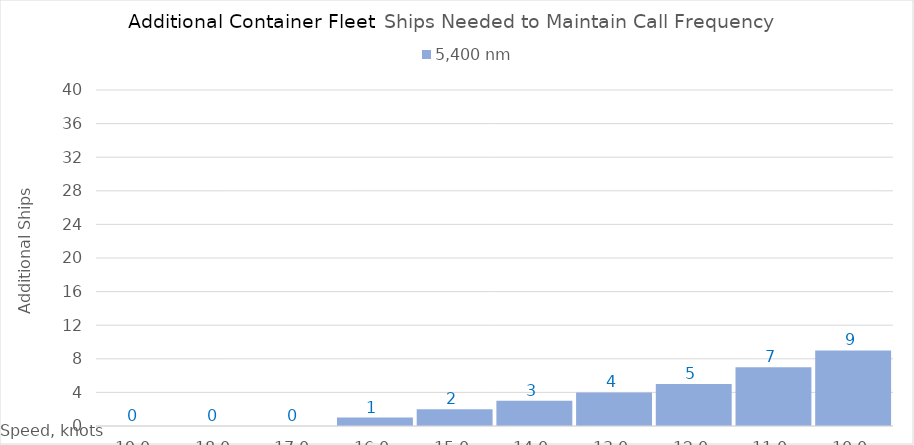
| Category | 5,400 |
|---|---|
| 19.0 | 0 |
| 18.0 | 0 |
| 17.0 | 0 |
| 16.0 | 1 |
| 15.0 | 2 |
| 14.0 | 3 |
| 13.0 | 4 |
| 12.0 | 5 |
| 11.0 | 7 |
| 10.0 | 9 |